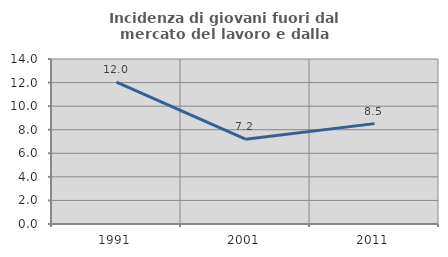
| Category | Incidenza di giovani fuori dal mercato del lavoro e dalla formazione  |
|---|---|
| 1991.0 | 12.044 |
| 2001.0 | 7.196 |
| 2011.0 | 8.518 |